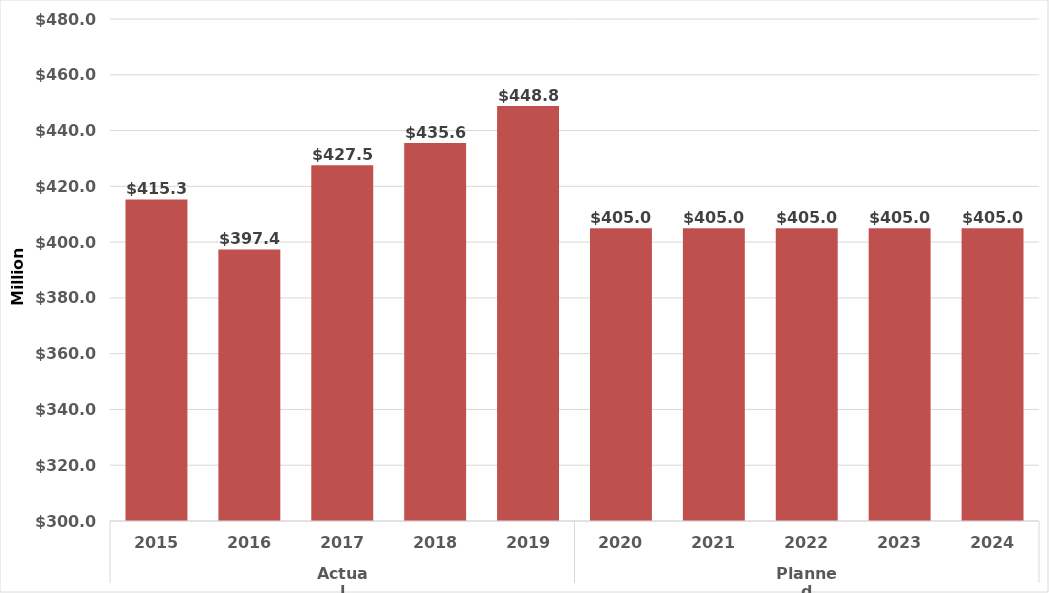
| Category | Series 1 |
|---|---|
| 0 | 415300000 |
| 1 | 397388000 |
| 2 | 427549000 |
| 3 | 435581000 |
| 4 | 448807863 |
| 5 | 405000000 |
| 6 | 405000000 |
| 7 | 405000000 |
| 8 | 405000000 |
| 9 | 405000000 |